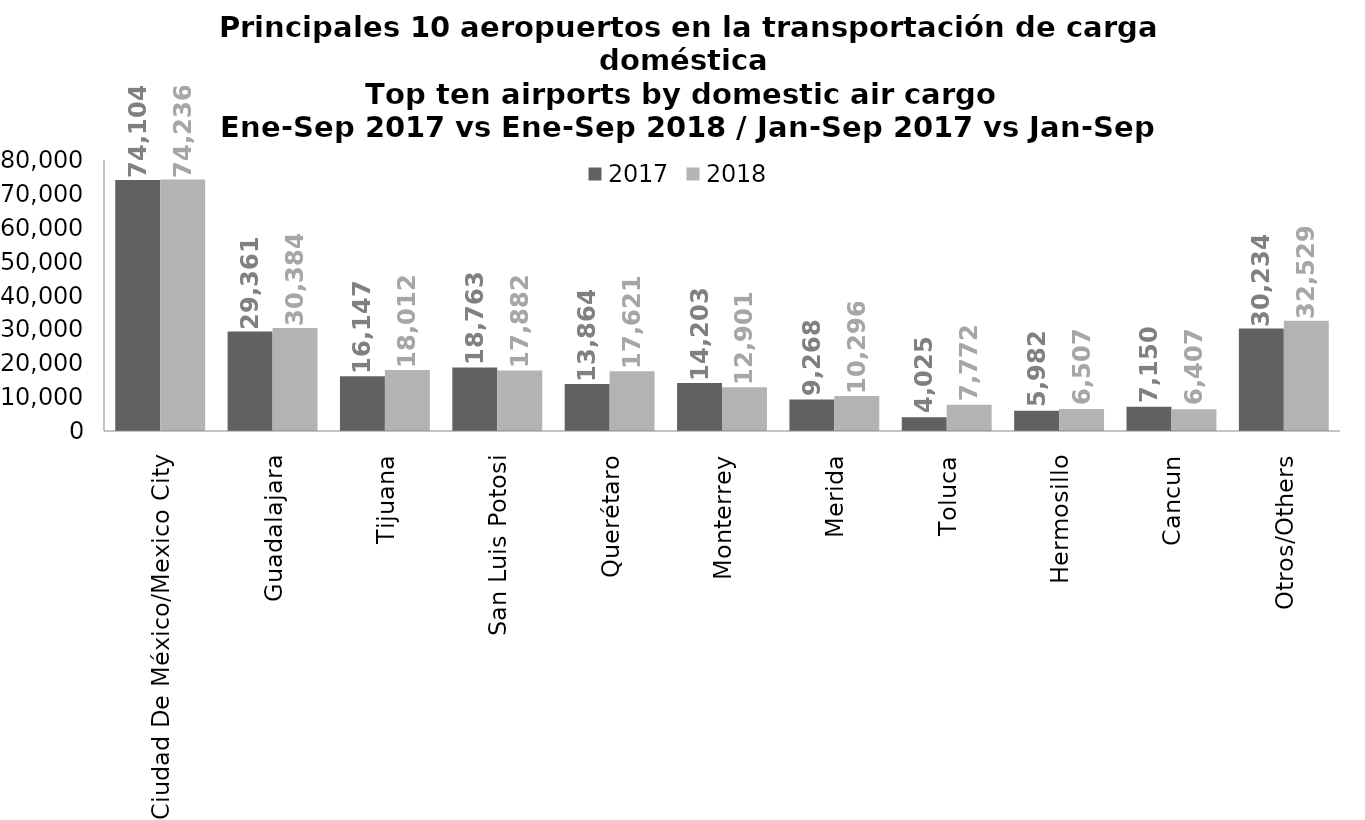
| Category | 2017 | 2018 |
|---|---|---|
| Ciudad De México/Mexico City | 74104.22 | 74235.64 |
| Guadalajara | 29360.994 | 30383.6 |
| Tijuana | 16146.835 | 18012.086 |
| San Luis Potosi | 18763.117 | 17881.883 |
| Querétaro | 13864.271 | 17620.966 |
| Monterrey | 14202.535 | 12901.313 |
| Merida | 9268.021 | 10296.058 |
| Toluca | 4024.595 | 7772.22 |
| Hermosillo | 5982.187 | 6506.56 |
| Cancun | 7149.711 | 6407.137 |
| Otros/Others | 30233.906 | 32529.222 |